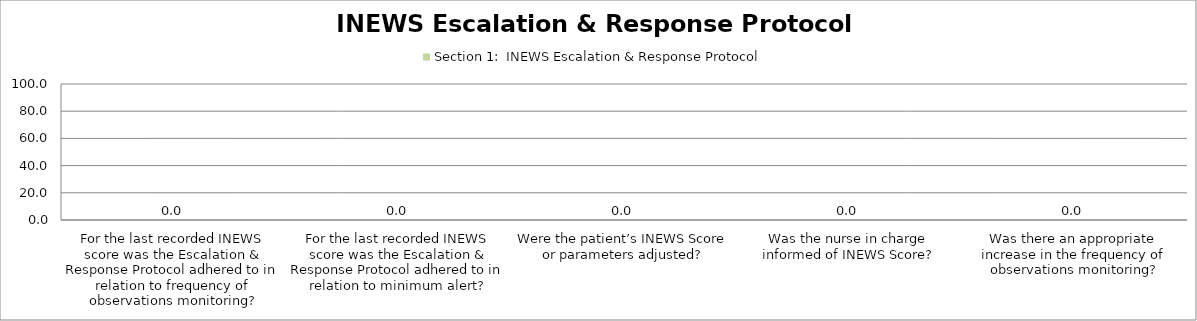
| Category | Section 1:  INEWS Escalation & Response Protocol |
|---|---|
| For the last recorded INEWS score was the Escalation & Response Protocol adhered to in relation to frequency of observations monitoring? | 0 |
| For the last recorded INEWS score was the Escalation & Response Protocol adhered to in relation to minimum alert? | 0 |
| Were the patient’s INEWS Score or parameters adjusted? | 0 |
| Was the nurse in charge informed of INEWS Score? | 0 |
| Was there an appropriate increase in the frequency of observations monitoring? | 0 |